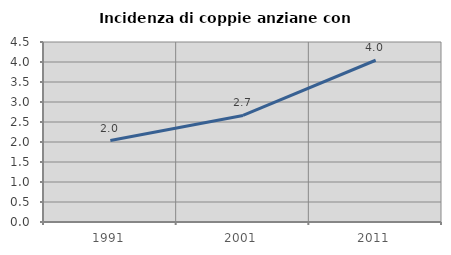
| Category | Incidenza di coppie anziane con figli |
|---|---|
| 1991.0 | 2.035 |
| 2001.0 | 2.663 |
| 2011.0 | 4.044 |